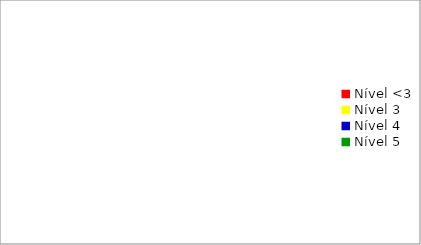
| Category | Series 0 |
|---|---|
| Nível <3 | 0 |
| Nível 3 | 0 |
| Nível 4 | 0 |
| Nível 5 | 0 |